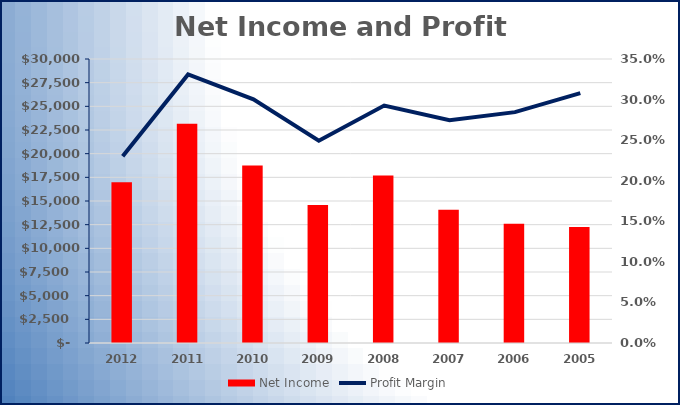
| Category | Net Income |
|---|---|
| 2012.0 | 16978 |
| 2011.0 | 23150 |
| 2010.0 | 18760 |
| 2009.0 | 14569 |
| 2008.0 | 17681 |
| 2007.0 | 14065 |
| 2006.0 | 12599 |
| 2005.0 | 12254 |